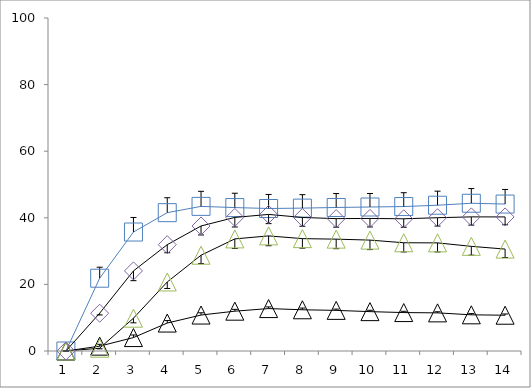
| Category | Series 0 | Series 1 | Series 2 | Series 3 |
|---|---|---|---|---|
| 0 | 0 | 0 | 0 | 0 |
| 1 | 21.859 | 1.459 | 0.839 | 11.348 |
| 2 | 35.73 | 4.032 | 9.852 | 24.056 |
| 3 | 41.544 | 8.394 | 20.728 | 31.926 |
| 4 | 43.431 | 10.8 | 28.76 | 37.539 |
| 5 | 43.071 | 11.96 | 33.662 | 40.117 |
| 6 | 42.792 | 12.74 | 34.564 | 41.017 |
| 7 | 42.908 | 12.381 | 33.746 | 40.1 |
| 8 | 43.1 | 12.197 | 33.589 | 39.751 |
| 9 | 43.241 | 11.821 | 33.301 | 39.807 |
| 10 | 43.378 | 11.54 | 32.507 | 39.705 |
| 11 | 43.777 | 11.451 | 32.468 | 40.025 |
| 12 | 44.366 | 10.867 | 31.427 | 40.274 |
| 13 | 44.127 | 10.743 | 30.606 | 40.26 |